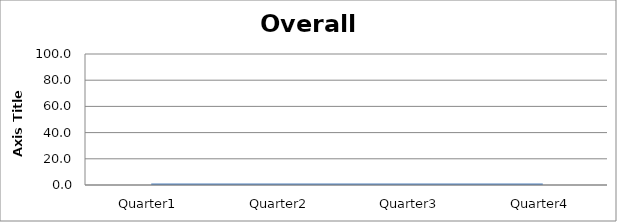
| Category | Overall Compliance |
|---|---|
| Quarter1 | 0 |
| Quarter2 | 0 |
| Quarter3 | 0 |
| Quarter4 | 0 |